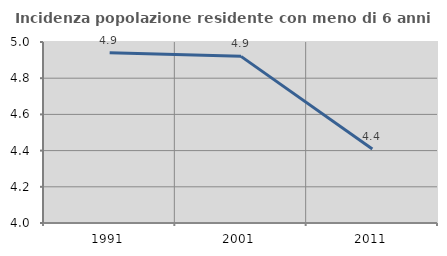
| Category | Incidenza popolazione residente con meno di 6 anni |
|---|---|
| 1991.0 | 4.94 |
| 2001.0 | 4.921 |
| 2011.0 | 4.409 |